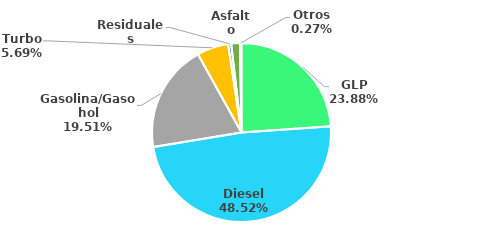
| Category | MBPD |
|---|---|
| GLP | 66.959 |
| Diesel | 136.059 |
| Gasolina/Gasohol | 54.708 |
| Turbo | 15.957 |
| Residuales | 1.535 |
| Asfalto | 4.424 |
| Otros | 0.751 |